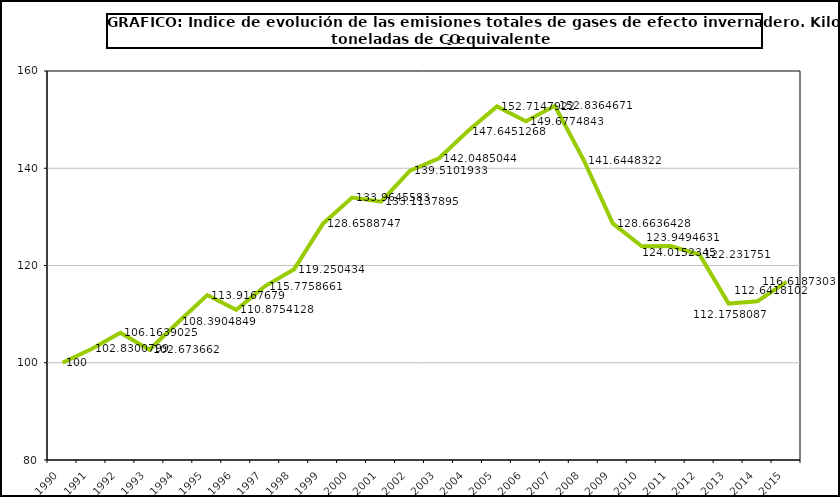
| Category | Series 0 |
|---|---|
| 1990.0 | 100 |
| 1991.0 | 102.83 |
| 1992.0 | 106.164 |
| 1993.0 | 102.674 |
| 1994.0 | 108.39 |
| 1995.0 | 113.917 |
| 1996.0 | 110.875 |
| 1997.0 | 115.776 |
| 1998.0 | 119.25 |
| 1999.0 | 128.659 |
| 2000.0 | 133.965 |
| 2001.0 | 133.114 |
| 2002.0 | 139.51 |
| 2003.0 | 142.049 |
| 2004.0 | 147.645 |
| 2005.0 | 152.715 |
| 2006.0 | 149.677 |
| 2007.0 | 152.836 |
| 2008.0 | 141.645 |
| 2009.0 | 128.664 |
| 2010.0 | 123.949 |
| 2011.0 | 124.015 |
| 2012.0 | 122.232 |
| 2013.0 | 112.176 |
| 2014.0 | 112.642 |
| 2015.0 | 116.619 |